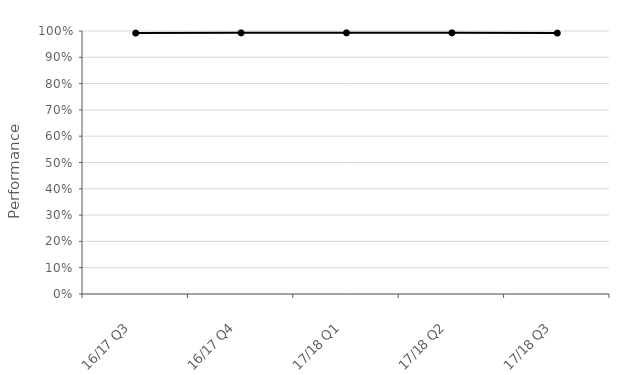
| Category | National (all NPS) |
|---|---|
| 16/17 Q3 | 0.992 |
| 16/17 Q4 | 0.993 |
| 17/18 Q1 | 0.993 |
| 17/18 Q2 | 0.993 |
| 17/18 Q3 | 0.992 |